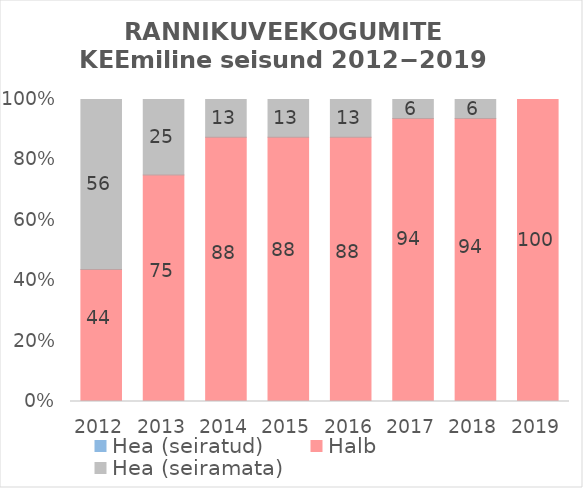
| Category | Hea (seiratud) | Halb | Hea (seiramata) |
|---|---|---|---|
| 2012.0 | 0 | 43.75 | 56.25 |
| 2013.0 | 0 | 75 | 25 |
| 2014.0 | 0 | 87.5 | 12.5 |
| 2015.0 | 0 | 87.5 | 12.5 |
| 2016.0 | 0 | 87.5 | 12.5 |
| 2017.0 | 0 | 93.75 | 6.25 |
| 2018.0 | 0 | 93.75 | 6.25 |
| 2019.0 | 0 | 100 | 0 |